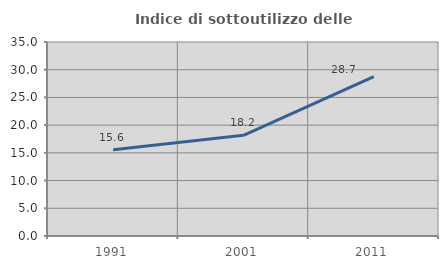
| Category | Indice di sottoutilizzo delle abitazioni  |
|---|---|
| 1991.0 | 15.575 |
| 2001.0 | 18.165 |
| 2011.0 | 28.747 |